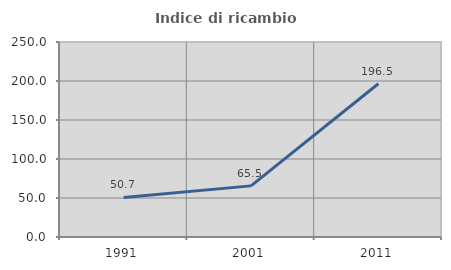
| Category | Indice di ricambio occupazionale  |
|---|---|
| 1991.0 | 50.673 |
| 2001.0 | 65.541 |
| 2011.0 | 196.471 |